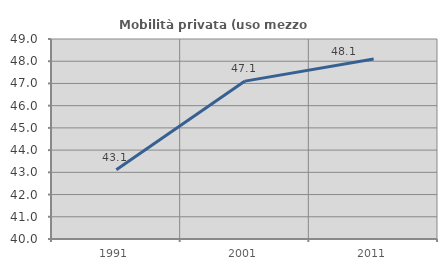
| Category | Mobilità privata (uso mezzo privato) |
|---|---|
| 1991.0 | 43.119 |
| 2001.0 | 47.105 |
| 2011.0 | 48.104 |